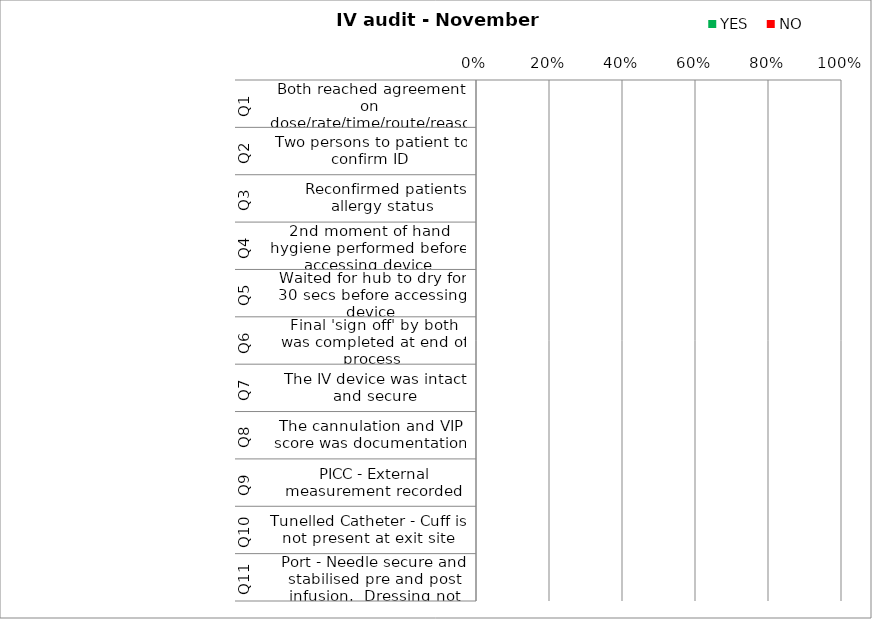
| Category | YES | NO |
|---|---|---|
| 0 | 0 | 0 |
| 1 | 0 | 0 |
| 2 | 0 | 0 |
| 3 | 0 | 0 |
| 4 | 0 | 0 |
| 5 | 0 | 0 |
| 6 | 0 | 0 |
| 7 | 0 | 0 |
| 8 | 0 | 0 |
| 9 | 0 | 0 |
| 10 | 0 | 0 |